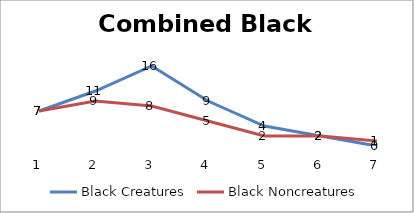
| Category | Black Creatures | Black Noncreatures |
|---|---|---|
| 0 | 7 | 7 |
| 1 | 11 | 9 |
| 2 | 16 | 8 |
| 3 | 9 | 5 |
| 4 | 4 | 2 |
| 5 | 2 | 2 |
| 6 | 0 | 1 |